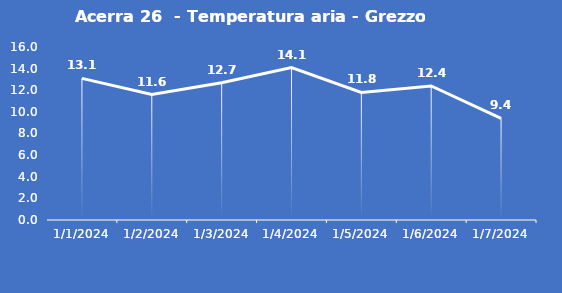
| Category | Acerra 26  - Temperatura aria - Grezzo (°C) |
|---|---|
| 1/1/24 | 13.1 |
| 1/2/24 | 11.6 |
| 1/3/24 | 12.7 |
| 1/4/24 | 14.1 |
| 1/5/24 | 11.8 |
| 1/6/24 | 12.4 |
| 1/7/24 | 9.4 |